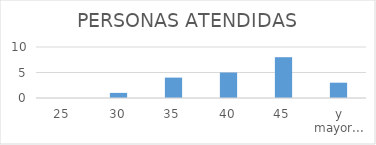
| Category | Series 0 |
|---|---|
| 25 | 0 |
| 30 | 1 |
| 35 | 4 |
| 40 | 5 |
| 45 | 8 |
| y mayor... | 3 |